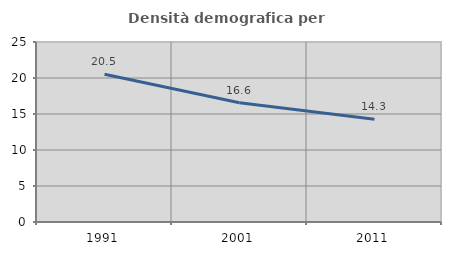
| Category | Densità demografica |
|---|---|
| 1991.0 | 20.516 |
| 2001.0 | 16.559 |
| 2011.0 | 14.282 |